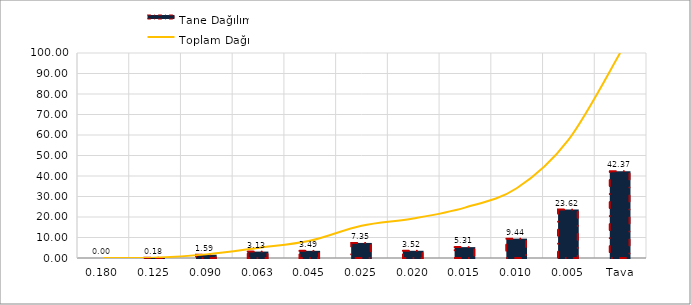
| Category | Tane Dağılımı |
|---|---|
| 0,180 | 0 |
| 0,125 | 0.18 |
| 0,090 | 1.59 |
| 0,063 | 3.13 |
| 0,045 | 3.49 |
| 0,025 | 7.35 |
| 0,020 | 3.52 |
| 0,015 | 5.31 |
| 0,010 | 9.44 |
| 0,005 | 23.62 |
| Tava | 42.37 |